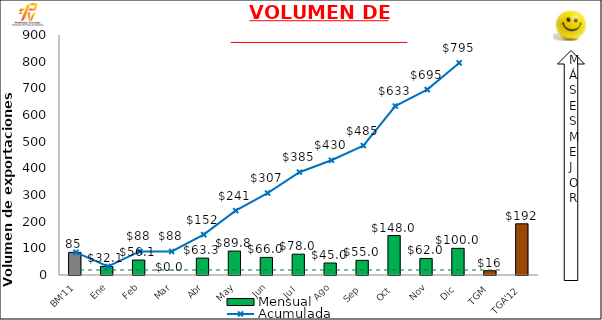
| Category | Mensual |
|---|---|
| BM'11 | 85 |
| Ene | 32.13 |
| Feb | 56.13 |
| Mar | 0 |
| Abr | 63.34 |
| May | 89.76 |
| Jun | 66 |
| Jul | 78 |
| Ago | 45 |
| Sep | 55 |
| Oct | 148 |
| Nov | 62 |
| Dic | 100 |
| TGM | 16 |
| TGA'12 | 192 |